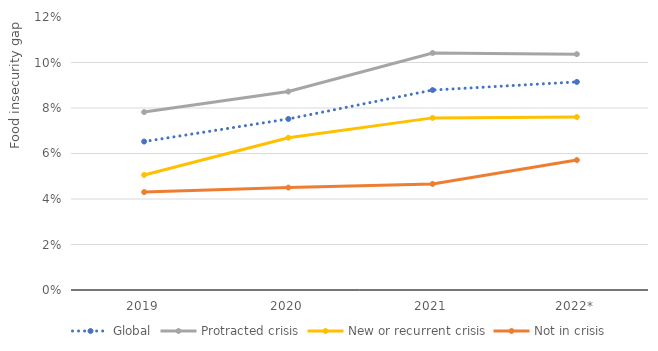
| Category | Global | Protracted crisis | New or recurrent crisis | Not in crisis |
|---|---|---|---|---|
| 2019 | 0.065 | 0.078 | 0.051 | 0.043 |
| 2020 | 0.075 | 0.087 | 0.067 | 0.045 |
| 2021 | 0.088 | 0.104 | 0.076 | 0.047 |
| 2022* | 0.091 | 0.104 | 0.076 | 0.057 |